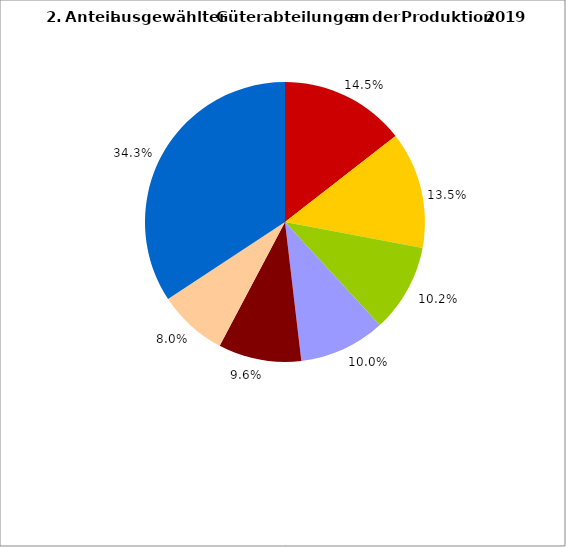
| Category | Series 0 |
|---|---|
| 0 | 14.481 |
| 1 | 13.484 |
| 2 | 10.199 |
| 3 | 9.969 |
| 4 | 9.593 |
| 5 | 8.01 |
| 6 | 34.265 |